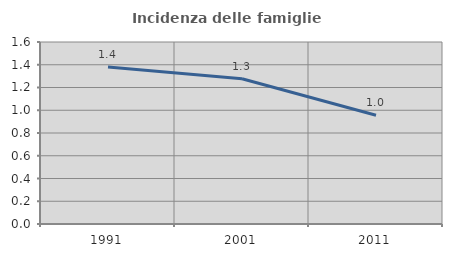
| Category | Incidenza delle famiglie numerose |
|---|---|
| 1991.0 | 1.379 |
| 2001.0 | 1.277 |
| 2011.0 | 0.956 |